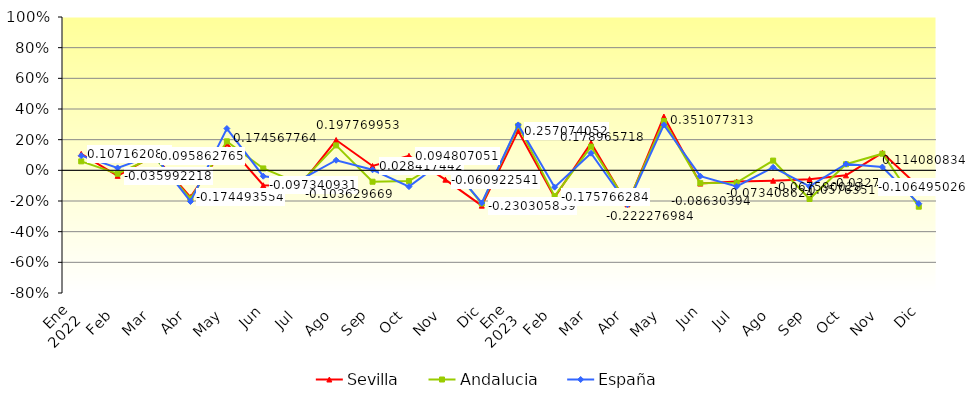
| Category | Sevilla  | Andalucia  | España |
|---|---|---|---|
| 0 | 0.107 | 0.059 | 0.096 |
| 1 | -0.036 | -0.022 | 0.016 |
| 2 | 0.096 | 0.087 | 0.101 |
| 3 | -0.174 | -0.184 | -0.203 |
| 4 | 0.175 | 0.189 | 0.272 |
| 5 | -0.097 | 0.012 | -0.038 |
| 6 | -0.104 | -0.087 | -0.064 |
| 7 | 0.198 | 0.163 | 0.066 |
| 8 | 0.028 | -0.074 | 0.004 |
| 9 | 0.095 | -0.07 | -0.106 |
| 10 | -0.061 | 0.074 | 0.07 |
| 11 | -0.23 | -0.216 | -0.213 |
| 12 | 0.257 | 0.29 | 0.296 |
| 13 | -0.176 | -0.168 | -0.11 |
| 14 | 0.179 | 0.155 | 0.111 |
| 15 | -0.222 | -0.215 | -0.224 |
| 16 | 0.351 | 0.322 | 0.296 |
| 17 | -0.086 | -0.084 | -0.038 |
| 18 | -0.073 | -0.08 | -0.105 |
| 19 | -0.068 | 0.063 | 0.02 |
| 20 | -0.058 | -0.187 | -0.105 |
| 21 | -0.033 | 0.04 | 0.041 |
| 22 | 0.114 | 0.108 | 0.021 |
| 23 | -0.106 | -0.237 | -0.217 |